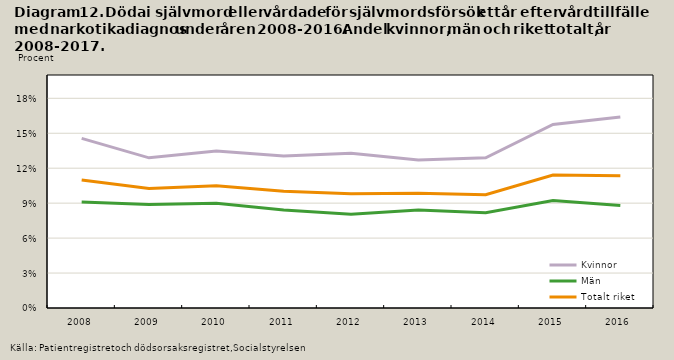
| Category | Kvinnor | Män | Totalt riket |
|---|---|---|---|
| 2008.0 | 0.146 | 0.091 | 0.11 |
| 2009.0 | 0.129 | 0.089 | 0.103 |
| 2010.0 | 0.135 | 0.09 | 0.105 |
| 2011.0 | 0.131 | 0.084 | 0.1 |
| 2012.0 | 0.133 | 0.08 | 0.098 |
| 2013.0 | 0.127 | 0.084 | 0.098 |
| 2014.0 | 0.129 | 0.082 | 0.097 |
| 2015.0 | 0.158 | 0.092 | 0.114 |
| 2016.0 | 0.164 | 0.088 | 0.113 |